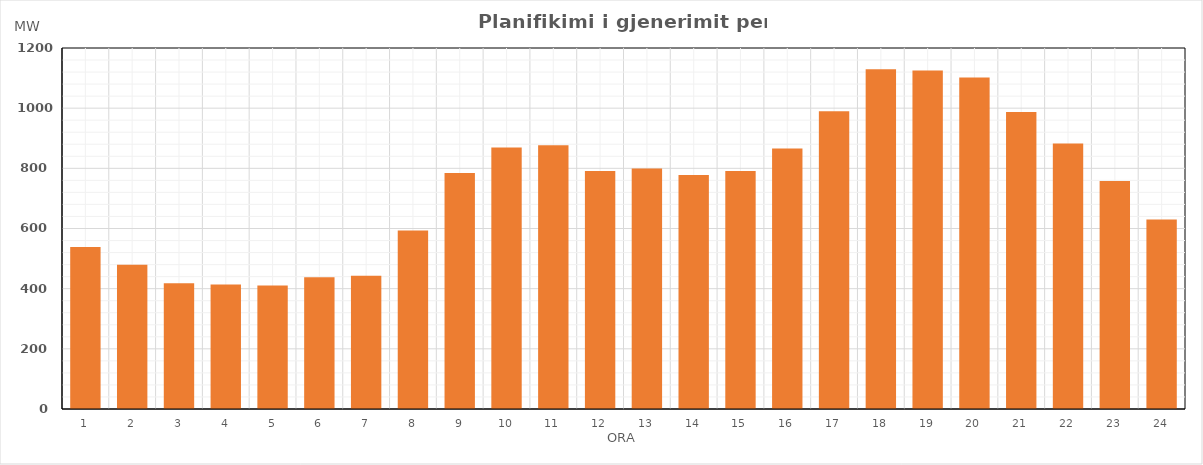
| Category | Max (MW) |
|---|---|
| 0 | 538.86 |
| 1 | 479.3 |
| 2 | 418.3 |
| 3 | 413.5 |
| 4 | 410.24 |
| 5 | 437.54 |
| 6 | 442.53 |
| 7 | 593.3 |
| 8 | 784.81 |
| 9 | 869.21 |
| 10 | 876.65 |
| 11 | 790.73 |
| 12 | 799.41 |
| 13 | 778.13 |
| 14 | 791.21 |
| 15 | 866.32 |
| 16 | 989.4 |
| 17 | 1128.97 |
| 18 | 1125.6 |
| 19 | 1102.13 |
| 20 | 987.16 |
| 21 | 882.19 |
| 22 | 757.61 |
| 23 | 629.78 |